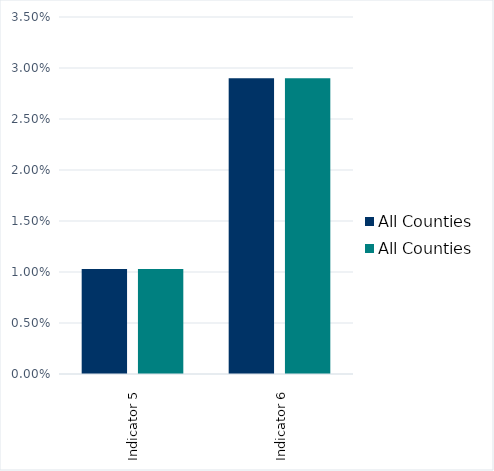
| Category | All Counties |
|---|---|
| Indicator 5 | 0.01 |
| Indicator 6 | 0.029 |